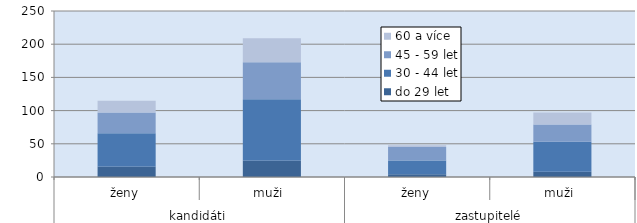
| Category | do 29 let | 30 - 44 let | 45 - 59 let | 60 a více |
|---|---|---|---|---|
| 0 | 16 | 50 | 31 | 18 |
| 1 | 25 | 92 | 56 | 36 |
| 2 | 4 | 21 | 20 | 3 |
| 3 | 8 | 45 | 26 | 18 |